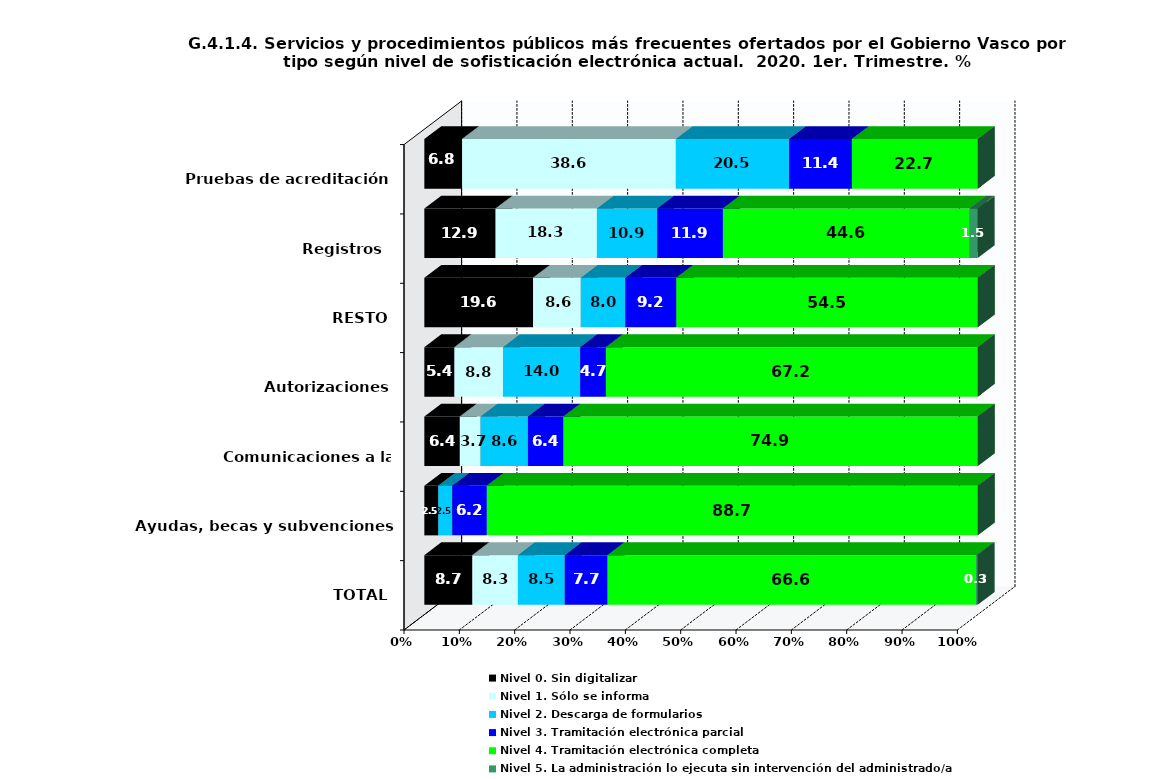
| Category | Nivel 0. Sin digitalizar | Nivel 1. Sólo se informa | Nivel 2. Descarga de formularios | Nivel 3. Tramitación electrónica parcial | Nivel 4. Tramitación electrónica completa | Nivel 5. La administración lo ejecuta sin intervención del administrado/a |
|---|---|---|---|---|---|---|
| TOTAL | 8.662 | 8.252 | 8.457 | 7.74 | 66.581 | 0.308 |
| Ayudas, becas y subvenciones | 2.53 | 0 | 2.53 | 6.239 | 88.702 | 0 |
| Comunicaciones a la Administración | 6.417 | 3.743 | 8.556 | 6.417 | 74.866 | 0 |
| Autorizaciones | 5.426 | 8.786 | 13.953 | 4.651 | 67.183 | 0 |
| RESTO | 19.643 | 8.631 | 8.036 | 9.226 | 54.464 | 0 |
| Registros  | 12.871 | 18.317 | 10.891 | 11.881 | 44.554 | 1.485 |
| Pruebas de acreditación | 6.818 | 38.636 | 20.455 | 11.364 | 22.727 | 0 |